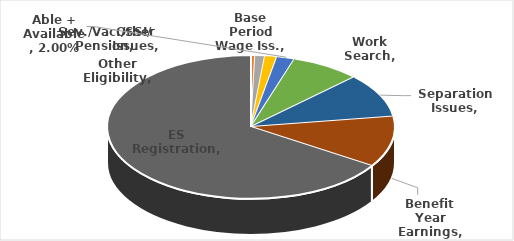
| Category | Series 0 |
|---|---|
| Base Period Wage Iss. | 0.001 |
| Sev./Vac./SSI/ Pension | 0.004 |
| Other Eligibility | 0.011 |
| Other Issues | 0.014 |
| Able + Available | 0.02 |
| Work Search | 0.078 |
| Separation Issues | 0.099 |
| Benefit Year Earnings | 0.115 |
| ES Registration | 0.659 |